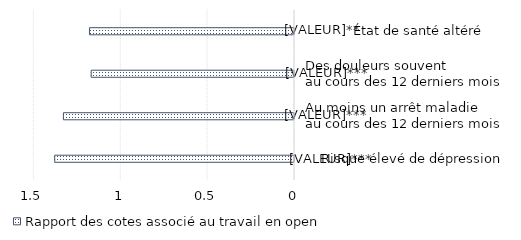
| Category | Rapport des cotes associé au travail en open space |
|---|---|
|     Risque élevé de dépression | 1.38 |
| Au moins un arrêt maladie 
au cours des 12 derniers mois | 1.33 |
| Des douleurs souvent 
au cours des 12 derniers mois | 1.17 |
|             État de santé altéré | 1.18 |